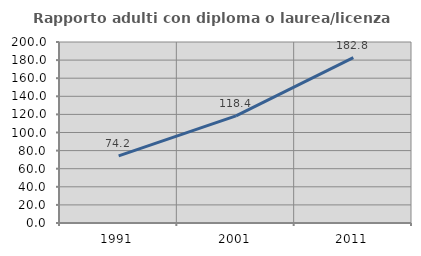
| Category | Rapporto adulti con diploma o laurea/licenza media  |
|---|---|
| 1991.0 | 74.207 |
| 2001.0 | 118.436 |
| 2011.0 | 182.781 |